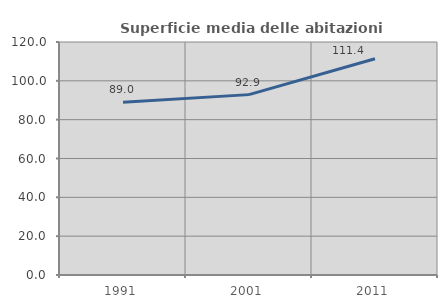
| Category | Superficie media delle abitazioni occupate |
|---|---|
| 1991.0 | 89.025 |
| 2001.0 | 92.896 |
| 2011.0 | 111.398 |